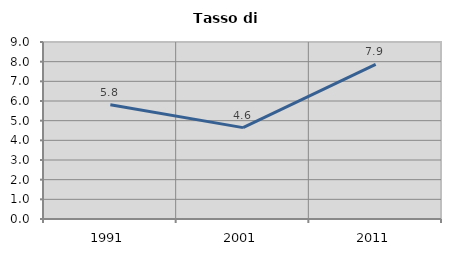
| Category | Tasso di disoccupazione   |
|---|---|
| 1991.0 | 5.81 |
| 2001.0 | 4.647 |
| 2011.0 | 7.865 |